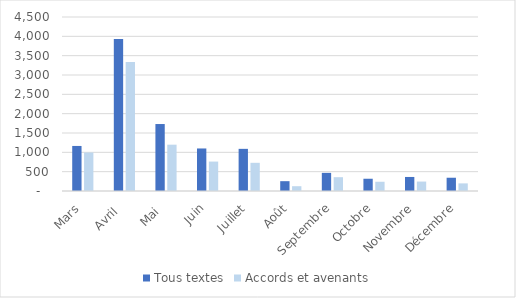
| Category | Tous textes | Accords et avenants |
|---|---|---|
| Mars | 1165 | 996 |
| Avril  | 3930 | 3338 |
| Mai  | 1732 | 1198 |
| Juin | 1100 | 761 |
| Juillet | 1090 | 729 |
| Août | 254 | 124 |
| Septembre | 469 | 357 |
| Octobre | 317 | 239 |
| Novembre | 363 | 244 |
| Décembre | 343 | 197 |